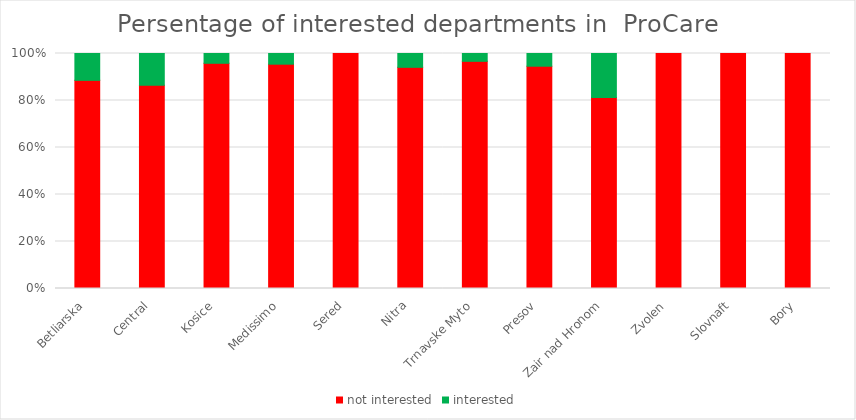
| Category | not interested | interested |
|---|---|---|
| Betliarska | 31 | 4 |
|  Central | 32 | 5 |
| Kosice | 23 | 1 |
|  Medissimo | 21 | 1 |
| Sered | 18 | 0 |
| Nitra | 16 | 1 |
| Trnavske Myto | 29 | 1 |
| Presov | 35 | 2 |
| Zair nad Hronom | 13 | 3 |
| Zvolen | 15 | 0 |
| Slovnaft | 12 | 0 |
| Bory | 3 | 0 |